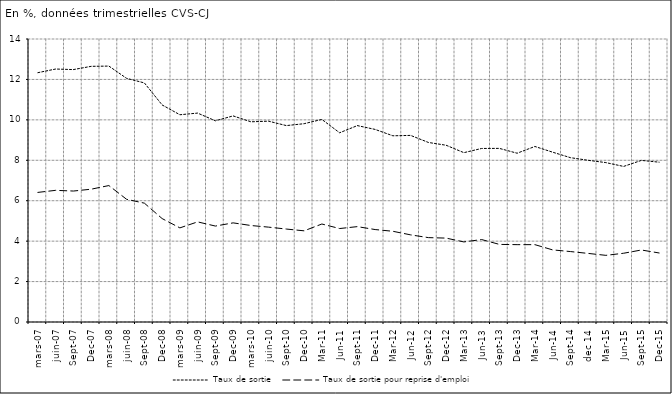
| Category | Taux de sortie | Taux de sortie pour reprise d'emploi |
|---|---|---|
| mars-07 | 12.334 | 6.411 |
| juin-07 | 12.514 | 6.513 |
| sept-07 | 12.487 | 6.479 |
| déc-07 | 12.648 | 6.57 |
| mars-08 | 12.66 | 6.75 |
| juin-08 | 12.054 | 6.069 |
| sept-08 | 11.827 | 5.879 |
| déc-08 | 10.738 | 5.117 |
| mars-09 | 10.253 | 4.656 |
| juin-09 | 10.334 | 4.953 |
| sept-09 | 9.953 | 4.746 |
| déc-09 | 10.195 | 4.904 |
| mars-10 | 9.904 | 4.774 |
| juin-10 | 9.935 | 4.693 |
| sept-10 | 9.716 | 4.598 |
| déc-10 | 9.81 | 4.511 |
| mars-11 | 10.021 | 4.848 |
| juin-11 | 9.361 | 4.623 |
| sept-11 | 9.716 | 4.718 |
| déc-11 | 9.527 | 4.574 |
| mars-12 | 9.211 | 4.488 |
| juin-12 | 9.231 | 4.31 |
| sept-12 | 8.883 | 4.174 |
| déc-12 | 8.744 | 4.15 |
| mars-13 | 8.377 | 3.961 |
| juin-13 | 8.585 | 4.079 |
| sept-13 | 8.589 | 3.839 |
| déc-13 | 8.349 | 3.827 |
| mars-14 | 8.684 | 3.826 |
| juin-14 | 8.401 | 3.567 |
| sept-14 | 8.131 | 3.485 |
| dec 14 | 7.999 | 3.393 |
| mars-15 | 7.885 | 3.297 |
| juin-15 | 7.697 | 3.401 |
| sept-15 | 7.994 | 3.562 |
| déc-15 | 7.906 | 3.414 |